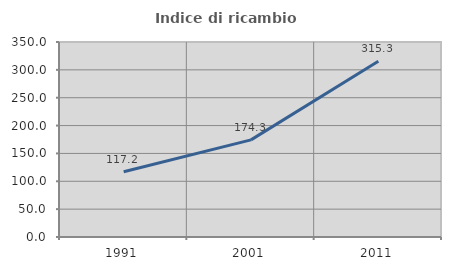
| Category | Indice di ricambio occupazionale  |
|---|---|
| 1991.0 | 117.182 |
| 2001.0 | 174.332 |
| 2011.0 | 315.276 |